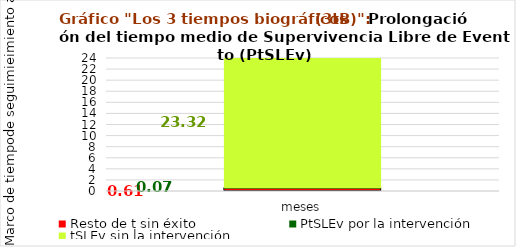
| Category | Resto de t sin éxito | PtSLEv por la intervención | tSLEv sin la intervención |
|---|---|---|---|
| meses | 0.606 | 0.069 | 23.325 |